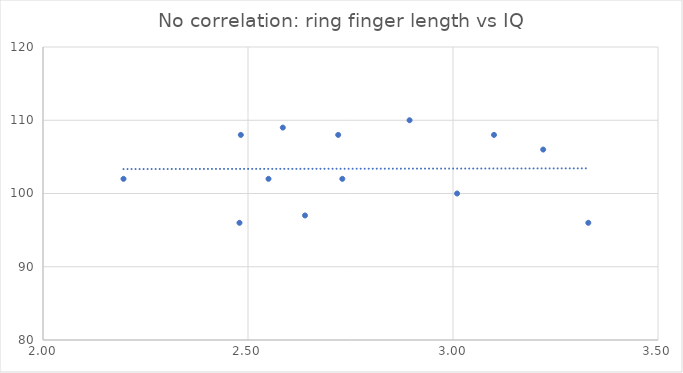
| Category | IQ |
|---|---|
| 2.894048097964328 | 110 |
| 2.550002597144463 | 102 |
| 3.1 | 108 |
| 2.639027910058865 | 97 |
| 3.33 | 96 |
| 3.22 | 106 |
| 2.4792442130854644 | 96 |
| 2.4825393825776363 | 108 |
| 2.730045798882795 | 102 |
| 3.01 | 100 |
| 2.1963396690344874 | 102 |
| 2.5848900021330667 | 109 |
| 2.72 | 108 |